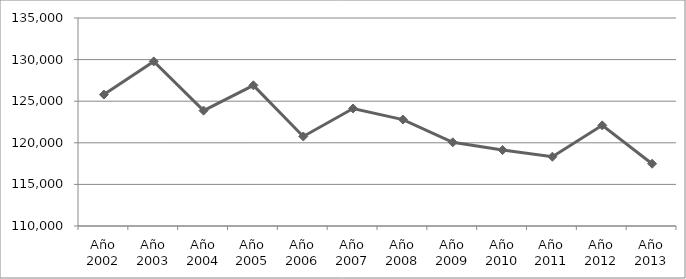
| Category | Series 0 |
|---|---|
| Año 2002 | 125797 |
| Año 2003 | 129783 |
| Año 2004 | 123867 |
| Año 2005 | 126907 |
| Año 2006 | 120760 |
| Año 2007 | 124126 |
| Año 2008 | 122793 |
| Año 2009 | 120057 |
| Año 2010 | 119128 |
| Año 2011 | 118327 |
| Año 2012 | 122097 |
| Año 2013 | 117484 |